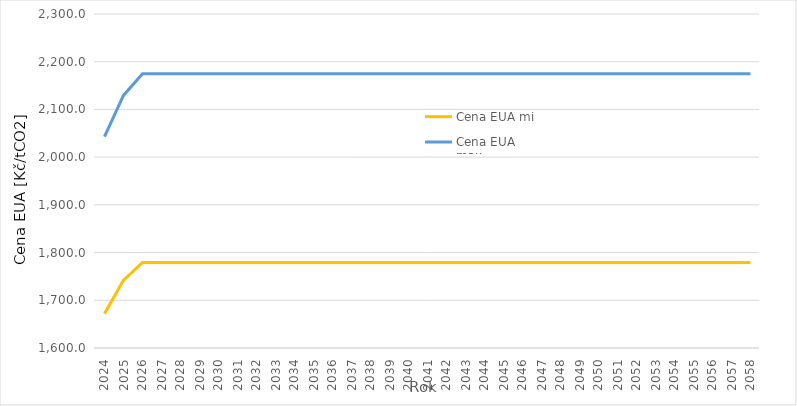
| Category | Cena EUA min. | Cena EUA max. |
|---|---|---|
| 2024.0 | 1671.646 | 2043.122 |
| 2025.0 | 1742.237 | 2129.4 |
| 2026.0 | 1779.268 | 2174.661 |
| 2027.0 | 1779.268 | 2174.661 |
| 2028.0 | 1779.268 | 2174.661 |
| 2029.0 | 1779.268 | 2174.661 |
| 2030.0 | 1779.268 | 2174.661 |
| 2031.0 | 1779.268 | 2174.661 |
| 2032.0 | 1779.268 | 2174.661 |
| 2033.0 | 1779.268 | 2174.661 |
| 2034.0 | 1779.268 | 2174.661 |
| 2035.0 | 1779.268 | 2174.661 |
| 2036.0 | 1779.268 | 2174.661 |
| 2037.0 | 1779.268 | 2174.661 |
| 2038.0 | 1779.268 | 2174.661 |
| 2039.0 | 1779.268 | 2174.661 |
| 2040.0 | 1779.268 | 2174.661 |
| 2041.0 | 1779.268 | 2174.661 |
| 2042.0 | 1779.268 | 2174.661 |
| 2043.0 | 1779.268 | 2174.661 |
| 2044.0 | 1779.268 | 2174.661 |
| 2045.0 | 1779.268 | 2174.661 |
| 2046.0 | 1779.268 | 2174.661 |
| 2047.0 | 1779.268 | 2174.661 |
| 2048.0 | 1779.268 | 2174.661 |
| 2049.0 | 1779.268 | 2174.661 |
| 2050.0 | 1779.268 | 2174.661 |
| 2051.0 | 1779.268 | 2174.661 |
| 2052.0 | 1779.268 | 2174.661 |
| 2053.0 | 1779.268 | 2174.661 |
| 2054.0 | 1779.268 | 2174.661 |
| 2055.0 | 1779.268 | 2174.661 |
| 2056.0 | 1779.268 | 2174.661 |
| 2057.0 | 1779.268 | 2174.661 |
| 2058.0 | 1779.268 | 2174.661 |